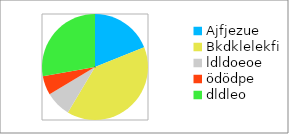
| Category | Series 0 |
|---|---|
| Ajfjezue | 0.189 |
| Bkdklelekfi | 0.396 |
| ldldoeoe | 0.078 |
| ödödpe | 0.058 |
| dldleo | 0.278 |